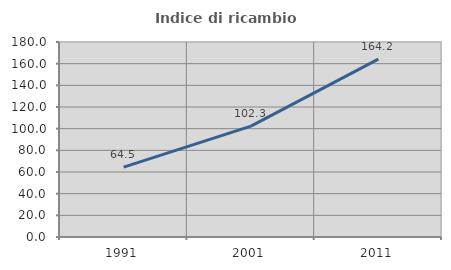
| Category | Indice di ricambio occupazionale  |
|---|---|
| 1991.0 | 64.463 |
| 2001.0 | 102.299 |
| 2011.0 | 164.151 |